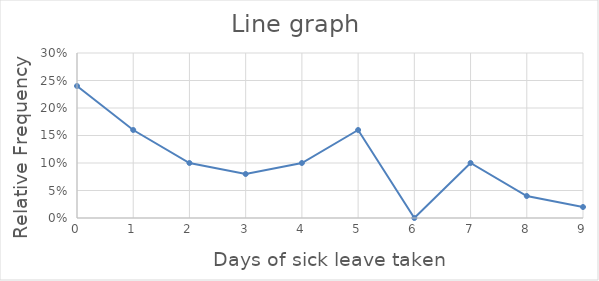
| Category | rel freq |
|---|---|
| 0.0 | 0.24 |
| 1.0 | 0.16 |
| 2.0 | 0.1 |
| 3.0 | 0.08 |
| 4.0 | 0.1 |
| 5.0 | 0.16 |
| 6.0 | 0 |
| 7.0 | 0.1 |
| 8.0 | 0.04 |
| 9.0 | 0.02 |